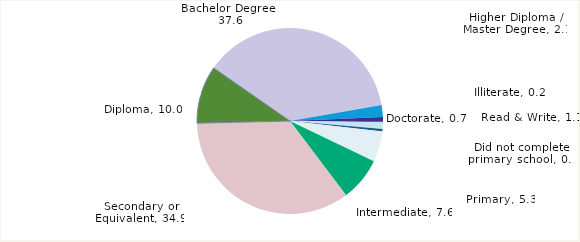
| Category | Series 0 |
|---|---|
| 0 | 0.204 |
| 1 | 1.148 |
| 2 | 0.452 |
| 3 | 5.319 |
| 4 | 7.585 |
| 5 | 34.918 |
| 6 | 10.047 |
| 7 | 37.582 |
| 8 | 2.078 |
| 9 | 0.667 |